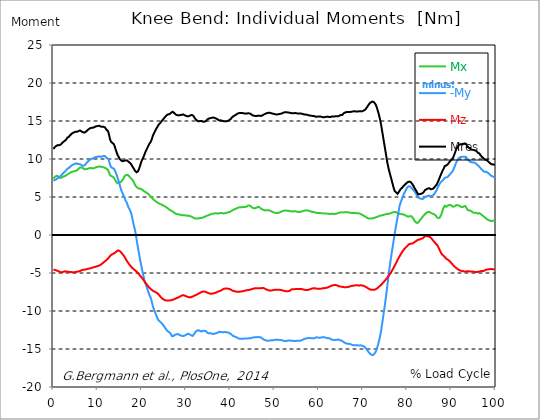
| Category |  Mx |  -My |  Mz |  Mres |
|---|---|---|---|---|
| 0.0 | 7.41 | 7.14 | -4.57 | 11.32 |
| 0.167348456675344 | 7.53 | 7.18 | -4.58 | 11.44 |
| 0.334696913350688 | 7.65 | 7.23 | -4.59 | 11.56 |
| 0.5020453700260321 | 7.73 | 7.28 | -4.61 | 11.65 |
| 0.669393826701376 | 7.78 | 7.34 | -4.65 | 11.73 |
| 0.83674228337672 | 7.78 | 7.41 | -4.7 | 11.79 |
| 1.0040907400520642 | 7.75 | 7.49 | -4.74 | 11.83 |
| 1.1621420602454444 | 7.68 | 7.55 | -4.78 | 11.83 |
| 1.3294905169207885 | 7.59 | 7.59 | -4.82 | 11.81 |
| 1.4968389735961325 | 7.5 | 7.67 | -4.86 | 11.82 |
| 1.6641874302714765 | 7.5 | 7.79 | -4.89 | 11.91 |
| 1.8315358869468206 | 7.57 | 7.88 | -4.9 | 12.01 |
| 1.9988843436221646 | 7.62 | 7.99 | -4.89 | 12.12 |
| 2.1662328002975086 | 7.67 | 8.09 | -4.87 | 12.2 |
| 2.333581256972853 | 7.71 | 8.2 | -4.83 | 12.29 |
| 2.5009297136481967 | 7.75 | 8.3 | -4.82 | 12.37 |
| 2.6682781703235405 | 7.77 | 8.37 | -4.78 | 12.43 |
| 2.8356266269988843 | 7.79 | 8.43 | -4.77 | 12.48 |
| 3.002975083674229 | 7.9 | 8.57 | -4.8 | 12.64 |
| 3.1703235403495724 | 8.01 | 8.72 | -4.82 | 12.82 |
| 3.337671997024917 | 8.03 | 8.79 | -4.84 | 12.89 |
| 3.4957233172182973 | 8.03 | 8.82 | -4.85 | 12.91 |
| 3.663071773893641 | 8.14 | 8.91 | -4.86 | 13.05 |
| 3.8304202305689854 | 8.22 | 9 | -4.88 | 13.17 |
| 3.997768687244329 | 8.27 | 9.08 | -4.88 | 13.25 |
| 4.165117143919673 | 8.3 | 9.17 | -4.9 | 13.34 |
| 4.332465600595017 | 8.33 | 9.23 | -4.91 | 13.41 |
| 4.499814057270361 | 8.35 | 9.28 | -4.92 | 13.46 |
| 4.667162513945706 | 8.39 | 9.32 | -4.92 | 13.51 |
| 4.834510970621049 | 8.44 | 9.35 | -4.9 | 13.56 |
| 5.001859427296393 | 8.44 | 9.4 | -4.87 | 13.58 |
| 5.169207883971737 | 8.46 | 9.43 | -4.86 | 13.61 |
| 5.336556340647081 | 8.49 | 9.38 | -4.84 | 13.59 |
| 5.503904797322425 | 8.59 | 9.35 | -4.82 | 13.62 |
| 5.671253253997769 | 8.69 | 9.33 | -4.79 | 13.66 |
| 5.82930457419115 | 8.77 | 9.33 | -4.77 | 13.7 |
| 5.996653030866494 | 8.87 | 9.32 | -4.74 | 13.76 |
| 6.164001487541838 | 8.92 | 9.28 | -4.7 | 13.75 |
| 6.331349944217181 | 8.88 | 9.16 | -4.64 | 13.63 |
| 6.498698400892526 | 8.85 | 9.1 | -4.6 | 13.55 |
| 6.66604685756787 | 8.8 | 9.11 | -4.58 | 13.53 |
| 6.833395314243213 | 8.71 | 9.12 | -4.56 | 13.47 |
| 7.000743770918558 | 8.66 | 9.16 | -4.56 | 13.47 |
| 7.168092227593902 | 8.65 | 9.23 | -4.55 | 13.51 |
| 7.335440684269246 | 8.67 | 9.33 | -4.53 | 13.58 |
| 7.50278914094459 | 8.66 | 9.45 | -4.51 | 13.65 |
| 7.6701375976199335 | 8.69 | 9.59 | -4.47 | 13.77 |
| 7.837486054295278 | 8.72 | 9.69 | -4.44 | 13.84 |
| 7.995537374488658 | 8.76 | 9.79 | -4.43 | 13.93 |
| 8.162885831164003 | 8.8 | 9.87 | -4.41 | 14.02 |
| 8.330234287839346 | 8.81 | 9.92 | -4.38 | 14.06 |
| 8.49758274451469 | 8.8 | 9.97 | -4.36 | 14.08 |
| 8.664931201190035 | 8.8 | 10.03 | -4.33 | 14.11 |
| 8.832279657865378 | 8.78 | 10.07 | -4.3 | 14.13 |
| 8.999628114540721 | 8.76 | 10.1 | -4.27 | 14.12 |
| 9.166976571216066 | 8.78 | 10.14 | -4.25 | 14.16 |
| 9.334325027891412 | 8.82 | 10.2 | -4.21 | 14.21 |
| 9.501673484566755 | 8.87 | 10.24 | -4.17 | 14.26 |
| 9.669021941242098 | 8.93 | 10.27 | -4.15 | 14.31 |
| 9.836370397917442 | 8.96 | 10.29 | -4.12 | 14.34 |
| 10.003718854592787 | 8.97 | 10.28 | -4.09 | 14.33 |
| 10.17106731126813 | 9 | 10.31 | -4.06 | 14.35 |
| 10.329118631461512 | 9.02 | 10.35 | -4.02 | 14.38 |
| 10.496467088136853 | 9.01 | 10.36 | -3.96 | 14.36 |
| 10.663815544812199 | 8.98 | 10.3 | -3.92 | 14.28 |
| 10.831164001487544 | 8.97 | 10.28 | -3.87 | 14.25 |
| 10.998512458162887 | 8.96 | 10.31 | -3.78 | 14.24 |
| 11.16586091483823 | 8.95 | 10.34 | -3.72 | 14.23 |
| 11.333209371513574 | 8.9 | 10.41 | -3.62 | 14.24 |
| 11.50055782818892 | 8.85 | 10.45 | -3.51 | 14.21 |
| 11.667906284864264 | 8.84 | 10.38 | -3.46 | 14.15 |
| 11.835254741539607 | 8.77 | 10.26 | -3.38 | 14.01 |
| 12.00260319821495 | 8.72 | 10.15 | -3.3 | 13.87 |
| 12.169951654890292 | 8.66 | 10.11 | -3.22 | 13.8 |
| 12.337300111565641 | 8.56 | 10.06 | -3.12 | 13.68 |
| 12.504648568240984 | 8.36 | 9.89 | -3 | 13.41 |
| 12.662699888434362 | 8.1 | 9.56 | -2.88 | 12.98 |
| 12.830048345109708 | 7.86 | 9.23 | -2.76 | 12.56 |
| 12.997396801785053 | 7.76 | 8.98 | -2.65 | 12.29 |
| 13.164745258460396 | 7.74 | 8.85 | -2.57 | 12.18 |
| 13.33209371513574 | 7.7 | 8.81 | -2.53 | 12.12 |
| 13.499442171811083 | 7.65 | 8.75 | -2.5 | 12.04 |
| 13.666790628486426 | 7.56 | 8.74 | -2.44 | 11.96 |
| 13.834139085161771 | 7.4 | 8.58 | -2.37 | 11.72 |
| 14.001487541837117 | 7.21 | 8.35 | -2.3 | 11.41 |
| 14.16883599851246 | 7.02 | 8.13 | -2.22 | 11.12 |
| 14.336184455187803 | 6.89 | 7.86 | -2.14 | 10.83 |
| 14.503532911863147 | 6.82 | 7.56 | -2.05 | 10.56 |
| 14.670881368538492 | 6.84 | 7.27 | -2.02 | 10.37 |
| 14.828932688731873 | 6.89 | 6.94 | -2.03 | 10.2 |
| 14.996281145407215 | 6.89 | 6.58 | -2.11 | 10 |
| 15.163629602082558 | 6.96 | 6.25 | -2.2 | 9.89 |
| 15.330978058757903 | 7.05 | 5.93 | -2.3 | 9.8 |
| 15.498326515433247 | 7.13 | 5.67 | -2.42 | 9.73 |
| 15.665674972108594 | 7.22 | 5.49 | -2.54 | 9.71 |
| 15.833023428783937 | 7.41 | 5.25 | -2.66 | 9.75 |
| 16.00037188545928 | 7.63 | 5 | -2.79 | 9.77 |
| 16.167720342134626 | 7.78 | 4.78 | -2.96 | 9.81 |
| 16.335068798809967 | 7.87 | 4.52 | -3.12 | 9.81 |
| 16.502417255485312 | 7.9 | 4.43 | -3.3 | 9.86 |
| 16.669765712160658 | 7.92 | 4.16 | -3.45 | 9.81 |
| 16.837114168836 | 7.91 | 3.87 | -3.59 | 9.73 |
| 17.004462625511344 | 7.82 | 3.61 | -3.72 | 9.63 |
| 17.16251394570472 | 7.7 | 3.46 | -3.87 | 9.56 |
| 17.32986240238007 | 7.63 | 3.24 | -4 | 9.49 |
| 17.497210859055414 | 7.51 | 3 | -4.12 | 9.36 |
| 17.664559315730756 | 7.39 | 2.72 | -4.24 | 9.23 |
| 17.8319077724061 | 7.27 | 2.25 | -4.33 | 9.06 |
| 17.999256229081443 | 7.14 | 1.79 | -4.42 | 8.9 |
| 18.166604685756788 | 6.99 | 1.3 | -4.5 | 8.75 |
| 18.333953142432133 | 6.77 | 0.95 | -4.58 | 8.58 |
| 18.501301599107478 | 6.56 | 0.55 | -4.66 | 8.41 |
| 18.668650055782823 | 6.42 | -0.01 | -4.74 | 8.31 |
| 18.835998512458165 | 6.32 | -0.66 | -4.83 | 8.25 |
| 19.00334696913351 | 6.23 | -1.24 | -4.93 | 8.29 |
| 19.170695425808855 | 6.15 | -1.81 | -5.04 | 8.41 |
| 19.338043882484197 | 6.11 | -2.35 | -5.15 | 8.64 |
| 19.496095202677576 | 6.1 | -2.89 | -5.27 | 8.92 |
| 19.66344365935292 | 6.08 | -3.41 | -5.39 | 9.22 |
| 19.830792116028263 | 6.05 | -3.91 | -5.5 | 9.56 |
| 19.998140572703612 | 6.01 | -4.39 | -5.63 | 9.8 |
| 20.165489029378953 | 5.93 | -4.85 | -5.75 | 10.01 |
| 20.3328374860543 | 5.84 | -5.32 | -5.87 | 10.21 |
| 20.500185942729644 | 5.76 | -5.69 | -6.01 | 10.44 |
| 20.667534399404985 | 5.7 | -6.13 | -6.15 | 10.7 |
| 20.83488285608033 | 5.64 | -6.43 | -6.3 | 10.94 |
| 21.002231312755672 | 5.6 | -6.67 | -6.43 | 11.15 |
| 21.16957976943102 | 5.54 | -6.95 | -6.55 | 11.36 |
| 21.336928226106362 | 5.46 | -7.23 | -6.67 | 11.55 |
| 21.504276682781704 | 5.37 | -7.53 | -6.79 | 11.75 |
| 21.67162513945705 | 5.28 | -7.83 | -6.9 | 11.96 |
| 21.82967645965043 | 5.18 | -8.04 | -7.01 | 12.11 |
| 21.997024916325774 | 5.08 | -8.23 | -7.11 | 12.25 |
| 22.16437337300112 | 4.96 | -8.57 | -7.18 | 12.47 |
| 22.33172182967646 | 4.87 | -8.98 | -7.25 | 12.76 |
| 22.499070286351806 | 4.75 | -9.39 | -7.33 | 13.06 |
| 22.666418743027148 | 4.65 | -9.67 | -7.39 | 13.28 |
| 22.833767199702496 | 4.57 | -9.92 | -7.44 | 13.47 |
| 23.00111565637784 | 4.49 | -10.16 | -7.5 | 13.66 |
| 23.168464113053183 | 4.42 | -10.43 | -7.54 | 13.86 |
| 23.335812569728528 | 4.35 | -10.68 | -7.59 | 14.05 |
| 23.50316102640387 | 4.3 | -10.89 | -7.66 | 14.2 |
| 23.670509483079215 | 4.23 | -11.12 | -7.74 | 14.38 |
| 23.83785793975456 | 4.16 | -11.27 | -7.85 | 14.53 |
| 23.995909259947936 | 4.11 | -11.37 | -7.96 | 14.65 |
| 24.163257716623285 | 4.06 | -11.41 | -8.08 | 14.73 |
| 24.330606173298627 | 4.05 | -11.53 | -8.18 | 14.87 |
| 24.49795462997397 | 4 | -11.62 | -8.28 | 14.99 |
| 24.665303086649313 | 3.94 | -11.71 | -8.37 | 15.1 |
| 24.83265154332466 | 3.89 | -11.84 | -8.45 | 15.23 |
| 25.0 | 3.83 | -11.99 | -8.51 | 15.35 |
| 25.167348456675345 | 3.78 | -12.13 | -8.56 | 15.47 |
| 25.334696913350694 | 3.73 | -12.26 | -8.59 | 15.58 |
| 25.502045370026035 | 3.68 | -12.41 | -8.61 | 15.69 |
| 25.669393826701377 | 3.6 | -12.56 | -8.62 | 15.79 |
| 25.836742283376722 | 3.53 | -12.63 | -8.61 | 15.82 |
| 26.004090740052067 | 3.46 | -12.72 | -8.61 | 15.88 |
| 26.17143919672741 | 3.39 | -12.81 | -8.62 | 15.93 |
| 26.329490516920792 | 3.3 | -12.85 | -8.61 | 15.93 |
| 26.49683897359613 | 3.22 | -12.92 | -8.6 | 15.95 |
| 26.66418743027148 | 3.19 | -13.15 | -8.58 | 16.11 |
| 26.831535886946828 | 3.15 | -13.32 | -8.55 | 16.22 |
| 26.998884343622166 | 3.08 | -13.36 | -8.53 | 16.22 |
| 27.166232800297514 | 3.01 | -13.28 | -8.49 | 16.12 |
| 27.333581256972852 | 2.93 | -13.24 | -8.43 | 16.04 |
| 27.5009297136482 | 2.86 | -13.14 | -8.4 | 15.93 |
| 27.668278170323543 | 2.8 | -13.08 | -8.36 | 15.85 |
| 27.835626626998888 | 2.78 | -13.06 | -8.31 | 15.8 |
| 28.002975083674233 | 2.74 | -13.05 | -8.28 | 15.77 |
| 28.170323540349575 | 2.72 | -13.03 | -8.24 | 15.73 |
| 28.33767199702492 | 2.7 | -13.07 | -8.2 | 15.74 |
| 28.50502045370026 | 2.68 | -13.14 | -8.13 | 15.77 |
| 28.663071773893645 | 2.67 | -13.18 | -8.09 | 15.78 |
| 28.830420230568986 | 2.65 | -13.22 | -8.04 | 15.78 |
| 28.99776868724433 | 2.62 | -13.28 | -7.98 | 15.81 |
| 29.165117143919673 | 2.6 | -13.3 | -7.94 | 15.81 |
| 29.33246560059502 | 2.61 | -13.37 | -7.94 | 15.87 |
| 29.499814057270367 | 2.59 | -13.27 | -7.94 | 15.77 |
| 29.66716251394571 | 2.59 | -13.26 | -7.97 | 15.77 |
| 29.834510970621054 | 2.58 | -13.2 | -8.01 | 15.73 |
| 30.00185942729639 | 2.57 | -13.12 | -8.06 | 15.67 |
| 30.169207883971744 | 2.56 | -13.06 | -8.09 | 15.64 |
| 30.33655634064708 | 2.54 | -13.03 | -8.12 | 15.62 |
| 30.50390479732243 | 2.54 | -12.99 | -8.16 | 15.61 |
| 30.671253253997772 | 2.54 | -13 | -8.2 | 15.64 |
| 30.829304574191156 | 2.5 | -13.08 | -8.21 | 15.7 |
| 30.996653030866494 | 2.46 | -13.15 | -8.2 | 15.75 |
| 31.164001487541842 | 2.42 | -13.21 | -8.18 | 15.79 |
| 31.331349944217187 | 2.39 | -13.24 | -8.14 | 15.79 |
| 31.498698400892525 | 2.34 | -13.27 | -8.09 | 15.78 |
| 31.666046857567874 | 2.27 | -13.2 | -8.04 | 15.68 |
| 31.833395314243212 | 2.22 | -13.01 | -8 | 15.5 |
| 32.00074377091856 | 2.17 | -12.89 | -7.95 | 15.37 |
| 32.1680922275939 | 2.15 | -12.74 | -7.91 | 15.23 |
| 32.33544068426925 | 2.16 | -12.64 | -7.86 | 15.12 |
| 32.50278914094459 | 2.17 | -12.57 | -7.82 | 15.04 |
| 32.670137597619934 | 2.18 | -12.54 | -7.76 | 14.99 |
| 32.83748605429528 | 2.19 | -12.54 | -7.71 | 14.96 |
| 33.004834510970625 | 2.2 | -12.56 | -7.67 | 14.96 |
| 33.162885831164004 | 2.22 | -12.63 | -7.61 | 14.99 |
| 33.33023428783935 | 2.24 | -12.69 | -7.54 | 15.03 |
| 33.497582744514695 | 2.25 | -12.69 | -7.5 | 15.01 |
| 33.664931201190036 | 2.27 | -12.65 | -7.47 | 14.96 |
| 33.83227965786538 | 2.3 | -12.6 | -7.45 | 14.91 |
| 33.99962811454073 | 2.34 | -12.61 | -7.44 | 14.91 |
| 34.16697657121607 | 2.39 | -12.62 | -7.45 | 14.92 |
| 34.33432502789141 | 2.43 | -12.64 | -7.47 | 14.95 |
| 34.50167348456676 | 2.48 | -12.65 | -7.49 | 14.98 |
| 34.6690219412421 | 2.52 | -12.72 | -7.54 | 15.08 |
| 34.83637039791744 | 2.53 | -12.87 | -7.6 | 15.23 |
| 35.00371885459279 | 2.58 | -12.9 | -7.63 | 15.29 |
| 35.17106731126814 | 2.62 | -12.93 | -7.66 | 15.33 |
| 35.338415767943474 | 2.66 | -12.93 | -7.7 | 15.36 |
| 35.49646708813686 | 2.72 | -12.92 | -7.73 | 15.37 |
| 35.6638155448122 | 2.76 | -12.92 | -7.73 | 15.38 |
| 35.831164001487544 | 2.79 | -12.97 | -7.72 | 15.42 |
| 35.998512458162885 | 2.8 | -13.02 | -7.7 | 15.45 |
| 36.165860914838234 | 2.8 | -13.04 | -7.68 | 15.47 |
| 36.333209371513576 | 2.82 | -13.01 | -7.66 | 15.43 |
| 36.50055782818892 | 2.82 | -12.97 | -7.63 | 15.39 |
| 36.667906284864266 | 2.86 | -12.92 | -7.6 | 15.35 |
| 36.83525474153961 | 2.86 | -12.91 | -7.56 | 15.32 |
| 37.002603198214956 | 2.84 | -12.92 | -7.51 | 15.29 |
| 37.1699516548903 | 2.82 | -12.85 | -7.46 | 15.2 |
| 37.337300111565646 | 2.84 | -12.77 | -7.43 | 15.13 |
| 37.50464856824098 | 2.85 | -12.73 | -7.39 | 15.07 |
| 37.66269988843437 | 2.89 | -12.74 | -7.36 | 15.07 |
| 37.83004834510971 | 2.93 | -12.76 | -7.33 | 15.09 |
| 37.99739680178505 | 2.91 | -12.79 | -7.28 | 15.08 |
| 38.16474525846039 | 2.86 | -12.78 | -7.2 | 15.03 |
| 38.33209371513574 | 2.84 | -12.78 | -7.13 | 14.99 |
| 38.49944217181109 | 2.83 | -12.78 | -7.09 | 14.97 |
| 38.666790628486424 | 2.85 | -12.77 | -7.07 | 14.95 |
| 38.83413908516178 | 2.87 | -12.77 | -7.05 | 14.95 |
| 39.001487541837115 | 2.89 | -12.77 | -7.05 | 14.96 |
| 39.16883599851246 | 2.93 | -12.79 | -7.05 | 14.98 |
| 39.336184455187805 | 2.95 | -12.81 | -7.05 | 15 |
| 39.503532911863154 | 2.98 | -12.83 | -7.06 | 15.03 |
| 39.670881368538495 | 3 | -12.89 | -7.08 | 15.09 |
| 39.83822982521384 | 3 | -12.93 | -7.11 | 15.14 |
| 39.996281145407224 | 3.06 | -12.95 | -7.15 | 15.19 |
| 40.163629602082565 | 3.12 | -13.03 | -7.2 | 15.3 |
| 40.33097805875791 | 3.19 | -13.15 | -7.27 | 15.45 |
| 40.498326515433256 | 3.25 | -13.23 | -7.32 | 15.55 |
| 40.6656749721086 | 3.3 | -13.27 | -7.36 | 15.61 |
| 40.83302342878393 | 3.36 | -13.33 | -7.38 | 15.69 |
| 41.00037188545929 | 3.41 | -13.36 | -7.4 | 15.73 |
| 41.16772034213463 | 3.43 | -13.4 | -7.42 | 15.78 |
| 41.33506879880997 | 3.47 | -13.44 | -7.46 | 15.84 |
| 41.50241725548531 | 3.54 | -13.48 | -7.48 | 15.89 |
| 41.66976571216066 | 3.57 | -13.57 | -7.47 | 15.98 |
| 41.837114168836 | 3.61 | -13.62 | -7.46 | 16.02 |
| 42.004462625511344 | 3.64 | -13.64 | -7.45 | 16.04 |
| 42.17181108218669 | 3.65 | -13.65 | -7.45 | 16.05 |
| 42.32986240238007 | 3.65 | -13.65 | -7.44 | 16.05 |
| 42.497210859055414 | 3.65 | -13.65 | -7.44 | 16.05 |
| 42.66455931573076 | 3.66 | -13.65 | -7.42 | 16.05 |
| 42.831907772406105 | 3.67 | -13.66 | -7.4 | 16.04 |
| 42.999256229081446 | 3.68 | -13.63 | -7.38 | 16.01 |
| 43.16660468575679 | 3.67 | -13.63 | -7.35 | 16.01 |
| 43.33395314243214 | 3.69 | -13.63 | -7.31 | 15.99 |
| 43.50130159910748 | 3.71 | -13.61 | -7.29 | 15.97 |
| 43.66865005578282 | 3.73 | -13.61 | -7.27 | 15.98 |
| 43.83599851245817 | 3.8 | -13.61 | -7.26 | 15.99 |
| 44.00334696913351 | 3.87 | -13.61 | -7.24 | 16.01 |
| 44.17069542580886 | 3.89 | -13.6 | -7.23 | 16.01 |
| 44.3380438824842 | 3.89 | -13.6 | -7.22 | 16 |
| 44.49609520267758 | 3.86 | -13.6 | -7.19 | 15.98 |
| 44.66344365935292 | 3.76 | -13.56 | -7.17 | 15.91 |
| 44.83079211602827 | 3.67 | -13.53 | -7.14 | 15.83 |
| 44.99814057270361 | 3.58 | -13.5 | -7.11 | 15.76 |
| 45.16548902937895 | 3.53 | -13.48 | -7.07 | 15.72 |
| 45.332837486054295 | 3.53 | -13.47 | -7.04 | 15.69 |
| 45.500185942729644 | 3.53 | -13.46 | -7.02 | 15.67 |
| 45.66753439940499 | 3.53 | -13.46 | -7.01 | 15.67 |
| 45.83488285608033 | 3.55 | -13.45 | -7 | 15.66 |
| 46.00223131275568 | 3.62 | -13.43 | -7.01 | 15.67 |
| 46.16957976943102 | 3.67 | -13.43 | -7 | 15.69 |
| 46.336928226106366 | 3.71 | -13.43 | -7.01 | 15.71 |
| 46.50427668278171 | 3.69 | -13.44 | -7.01 | 15.71 |
| 46.671625139457056 | 3.61 | -13.44 | -7.01 | 15.68 |
| 46.829676459650436 | 3.51 | -13.44 | -7 | 15.64 |
| 46.99702491632577 | 3.44 | -13.51 | -6.98 | 15.67 |
| 47.16437337300112 | 3.4 | -13.58 | -6.98 | 15.71 |
| 47.33172182967646 | 3.35 | -13.66 | -6.97 | 15.76 |
| 47.49907028635181 | 3.3 | -13.73 | -6.98 | 15.81 |
| 47.66641874302716 | 3.27 | -13.8 | -7.01 | 15.88 |
| 47.83376719970249 | 3.23 | -13.83 | -7.06 | 15.91 |
| 48.001115656377834 | 3.25 | -13.86 | -7.11 | 15.96 |
| 48.16846411305319 | 3.27 | -13.88 | -7.16 | 16.01 |
| 48.33581256972853 | 3.27 | -13.91 | -7.2 | 16.05 |
| 48.50316102640387 | 3.25 | -13.92 | -7.24 | 16.07 |
| 48.67050948307921 | 3.25 | -13.91 | -7.29 | 16.08 |
| 48.837857939754564 | 3.22 | -13.89 | -7.3 | 16.07 |
| 49.005206396429905 | 3.2 | -13.88 | -7.32 | 16.07 |
| 49.163257716623285 | 3.16 | -13.87 | -7.32 | 16.05 |
| 49.33060617329863 | 3.11 | -13.85 | -7.31 | 16.01 |
| 49.49795462997397 | 3.07 | -13.84 | -7.29 | 15.99 |
| 49.66530308664932 | 3.02 | -13.83 | -7.26 | 15.96 |
| 49.832651543324666 | 2.99 | -13.84 | -7.23 | 15.95 |
| 50.0 | 2.94 | -13.82 | -7.22 | 15.92 |
| 50.16734845667534 | 2.91 | -13.79 | -7.21 | 15.88 |
| 50.33469691335069 | 2.89 | -13.77 | -7.2 | 15.86 |
| 50.50204537002604 | 2.89 | -13.77 | -7.2 | 15.85 |
| 50.66939382670139 | 2.89 | -13.78 | -7.2 | 15.87 |
| 50.836742283376715 | 2.91 | -13.78 | -7.2 | 15.88 |
| 51.00409074005207 | 2.94 | -13.82 | -7.2 | 15.91 |
| 51.17143919672741 | 2.97 | -13.82 | -7.2 | 15.93 |
| 51.32949051692079 | 3.02 | -13.82 | -7.22 | 15.94 |
| 51.496838973596134 | 3.06 | -13.83 | -7.24 | 15.97 |
| 51.66418743027148 | 3.11 | -13.84 | -7.27 | 16 |
| 51.831535886946824 | 3.14 | -13.87 | -7.3 | 16.04 |
| 51.99888434362217 | 3.17 | -13.91 | -7.32 | 16.09 |
| 52.16623280029752 | 3.2 | -13.95 | -7.34 | 16.14 |
| 52.33358125697285 | 3.21 | -13.95 | -7.37 | 16.16 |
| 52.5009297136482 | 3.22 | -13.94 | -7.39 | 16.16 |
| 52.668278170323546 | 3.21 | -13.93 | -7.41 | 16.16 |
| 52.835626626998895 | 3.2 | -13.93 | -7.41 | 16.16 |
| 53.00297508367424 | 3.19 | -13.91 | -7.4 | 16.13 |
| 53.17032354034958 | 3.17 | -13.88 | -7.38 | 16.1 |
| 53.33767199702492 | 3.17 | -13.88 | -7.37 | 16.1 |
| 53.50502045370027 | 3.16 | -13.89 | -7.33 | 16.09 |
| 53.663071773893655 | 3.12 | -13.9 | -7.24 | 16.05 |
| 53.83042023056899 | 3.1 | -13.91 | -7.16 | 16.03 |
| 53.99776868724433 | 3.1 | -13.92 | -7.14 | 16.03 |
| 54.16511714391967 | 3.1 | -13.92 | -7.13 | 16.02 |
| 54.33246560059503 | 3.11 | -13.93 | -7.13 | 16.03 |
| 54.49981405727037 | 3.12 | -13.95 | -7.13 | 16.05 |
| 54.667162513945705 | 3.13 | -13.95 | -7.12 | 16.05 |
| 54.834510970621054 | 3.11 | -13.94 | -7.11 | 16.03 |
| 55.0018594272964 | 3.08 | -13.93 | -7.1 | 16.01 |
| 55.169207883971744 | 3.05 | -13.92 | -7.1 | 15.99 |
| 55.336556340647086 | 3.03 | -13.91 | -7.1 | 15.98 |
| 55.50390479732243 | 3.02 | -13.93 | -7.1 | 15.99 |
| 55.671253253997776 | 3.04 | -13.91 | -7.11 | 15.99 |
| 55.83860171067312 | 3.07 | -13.91 | -7.11 | 15.99 |
| 55.9966530308665 | 3.08 | -13.88 | -7.11 | 15.98 |
| 56.16400148754184 | 3.1 | -13.84 | -7.12 | 15.95 |
| 56.33134994421718 | 3.12 | -13.79 | -7.14 | 15.93 |
| 56.498698400892536 | 3.15 | -13.74 | -7.17 | 15.9 |
| 56.66604685756788 | 3.19 | -13.68 | -7.19 | 15.87 |
| 56.83339531424321 | 3.23 | -13.65 | -7.21 | 15.85 |
| 57.00074377091856 | 3.24 | -13.63 | -7.22 | 15.85 |
| 57.16809222759391 | 3.24 | -13.62 | -7.24 | 15.85 |
| 57.33544068426925 | 3.23 | -13.6 | -7.24 | 15.83 |
| 57.5027891409446 | 3.22 | -13.57 | -7.23 | 15.8 |
| 57.670137597619934 | 3.21 | -13.54 | -7.2 | 15.76 |
| 57.83748605429528 | 3.16 | -13.55 | -7.18 | 15.74 |
| 58.004834510970625 | 3.14 | -13.55 | -7.15 | 15.72 |
| 58.16288583116401 | 3.11 | -13.57 | -7.11 | 15.71 |
| 58.330234287839346 | 3.07 | -13.59 | -7.07 | 15.69 |
| 58.497582744514695 | 3.05 | -13.59 | -7.04 | 15.67 |
| 58.66493120119004 | 3.04 | -13.59 | -7.02 | 15.66 |
| 58.832279657865385 | 3.01 | -13.6 | -7 | 15.65 |
| 58.999628114540734 | 3 | -13.59 | -6.99 | 15.64 |
| 59.16697657121607 | 2.96 | -13.54 | -7 | 15.6 |
| 59.33432502789142 | 2.94 | -13.5 | -7.02 | 15.57 |
| 59.50167348456676 | 2.87 | -13.46 | -7.06 | 15.55 |
| 59.66902194124211 | 2.88 | -13.48 | -7.07 | 15.57 |
| 59.83637039791745 | 2.9 | -13.5 | -7.07 | 15.59 |
| 60.00371885459278 | 2.9 | -13.51 | -7.08 | 15.6 |
| 60.17106731126813 | 2.9 | -13.51 | -7.09 | 15.6 |
| 60.33841576794349 | 2.89 | -13.51 | -7.08 | 15.6 |
| 60.49646708813685 | 2.89 | -13.5 | -7.07 | 15.58 |
| 60.6638155448122 | 2.86 | -13.47 | -7.05 | 15.54 |
| 60.831164001487544 | 2.85 | -13.46 | -7.02 | 15.51 |
| 60.99851245816289 | 2.84 | -13.44 | -7.01 | 15.49 |
| 61.16586091483824 | 2.84 | -13.43 | -7 | 15.48 |
| 61.333209371513576 | 2.83 | -13.47 | -6.98 | 15.51 |
| 61.50055782818892 | 2.82 | -13.51 | -6.97 | 15.54 |
| 61.667906284864266 | 2.82 | -13.53 | -6.96 | 15.55 |
| 61.835254741539615 | 2.81 | -13.55 | -6.94 | 15.55 |
| 62.002603198214956 | 2.81 | -13.59 | -6.91 | 15.58 |
| 62.16995165489029 | 2.79 | -13.6 | -6.87 | 15.56 |
| 62.33730011156564 | 2.78 | -13.59 | -6.83 | 15.53 |
| 62.504648568240995 | 2.77 | -13.6 | -6.78 | 15.51 |
| 62.67199702491633 | 2.77 | -13.64 | -6.74 | 15.53 |
| 62.83004834510971 | 2.79 | -13.74 | -6.67 | 15.59 |
| 62.99739680178505 | 2.79 | -13.77 | -6.64 | 15.6 |
| 63.1647452584604 | 2.78 | -13.78 | -6.63 | 15.59 |
| 63.33209371513575 | 2.78 | -13.79 | -6.61 | 15.6 |
| 63.4994421718111 | 2.77 | -13.82 | -6.59 | 15.61 |
| 63.666790628486424 | 2.77 | -13.81 | -6.59 | 15.61 |
| 63.83413908516177 | 2.79 | -13.8 | -6.59 | 15.6 |
| 64.00148754183712 | 2.8 | -13.8 | -6.6 | 15.61 |
| 64.16883599851248 | 2.83 | -13.78 | -6.62 | 15.6 |
| 64.3361844551878 | 2.89 | -13.75 | -6.67 | 15.61 |
| 64.50353291186315 | 2.95 | -13.76 | -6.74 | 15.65 |
| 64.6708813685385 | 2.96 | -13.8 | -6.77 | 15.7 |
| 64.83822982521384 | 2.97 | -13.86 | -6.78 | 15.76 |
| 65.00557828188919 | 2.97 | -13.9 | -6.79 | 15.8 |
| 65.16362960208257 | 2.97 | -13.89 | -6.8 | 15.8 |
| 65.3309780587579 | 2.98 | -13.89 | -6.81 | 15.8 |
| 65.49832651543326 | 2.98 | -14.02 | -6.84 | 15.93 |
| 65.6656749721086 | 2.97 | -14.11 | -6.87 | 16.02 |
| 65.83302342878395 | 2.98 | -14.16 | -6.87 | 16.07 |
| 66.00037188545929 | 3 | -14.22 | -6.88 | 16.13 |
| 66.16772034213463 | 2.99 | -14.27 | -6.87 | 16.16 |
| 66.33506879880998 | 2.99 | -14.29 | -6.86 | 16.18 |
| 66.50241725548531 | 2.98 | -14.3 | -6.85 | 16.19 |
| 66.66976571216065 | 2.98 | -14.31 | -6.83 | 16.19 |
| 66.83711416883601 | 2.96 | -14.32 | -6.81 | 16.19 |
| 67.00446262551135 | 2.94 | -14.33 | -6.78 | 16.18 |
| 67.1718110821867 | 2.93 | -14.35 | -6.75 | 16.18 |
| 67.32986240238007 | 2.91 | -14.4 | -6.73 | 16.21 |
| 67.49721085905541 | 2.88 | -14.44 | -6.7 | 16.24 |
| 67.66455931573076 | 2.88 | -14.47 | -6.69 | 16.25 |
| 67.83190777240611 | 2.89 | -14.49 | -6.67 | 16.27 |
| 67.99925622908145 | 2.9 | -14.51 | -6.65 | 16.28 |
| 68.16660468575678 | 2.88 | -14.52 | -6.63 | 16.27 |
| 68.33395314243214 | 2.88 | -14.51 | -6.63 | 16.26 |
| 68.50130159910749 | 2.88 | -14.49 | -6.62 | 16.24 |
| 68.66865005578282 | 2.87 | -14.49 | -6.62 | 16.24 |
| 68.83599851245816 | 2.88 | -14.52 | -6.63 | 16.27 |
| 69.00334696913352 | 2.86 | -14.52 | -6.63 | 16.27 |
| 69.17069542580886 | 2.83 | -14.53 | -6.64 | 16.28 |
| 69.3380438824842 | 2.81 | -14.53 | -6.63 | 16.28 |
| 69.50539233915956 | 2.75 | -14.52 | -6.61 | 16.25 |
| 69.66344365935292 | 2.7 | -14.54 | -6.62 | 16.26 |
| 69.83079211602826 | 2.65 | -14.57 | -6.64 | 16.29 |
| 69.99814057270362 | 2.6 | -14.61 | -6.66 | 16.32 |
| 70.16548902937896 | 2.54 | -14.65 | -6.7 | 16.37 |
| 70.33283748605429 | 2.48 | -14.71 | -6.74 | 16.42 |
| 70.50018594272964 | 2.42 | -14.78 | -6.78 | 16.49 |
| 70.667534399405 | 2.37 | -14.87 | -6.85 | 16.59 |
| 70.83488285608033 | 2.26 | -15.05 | -6.9 | 16.75 |
| 71.00223131275568 | 2.23 | -15.15 | -6.95 | 16.86 |
| 71.16957976943102 | 2.19 | -15.32 | -7.02 | 17.04 |
| 71.33692822610637 | 2.17 | -15.42 | -7.1 | 17.17 |
| 71.50427668278171 | 2.17 | -15.56 | -7.14 | 17.31 |
| 71.67162513945706 | 2.16 | -15.68 | -7.16 | 17.43 |
| 71.8389735961324 | 2.17 | -15.72 | -7.19 | 17.48 |
| 71.99702491632577 | 2.17 | -15.79 | -7.2 | 17.54 |
| 72.16437337300113 | 2.18 | -15.81 | -7.21 | 17.56 |
| 72.33172182967647 | 2.21 | -15.76 | -7.22 | 17.52 |
| 72.49907028635181 | 2.24 | -15.7 | -7.21 | 17.47 |
| 72.66641874302715 | 2.27 | -15.59 | -7.18 | 17.37 |
| 72.8337671997025 | 2.31 | -15.42 | -7.15 | 17.21 |
| 73.00111565637783 | 2.35 | -15.21 | -7.09 | 17 |
| 73.16846411305319 | 2.38 | -14.92 | -7.04 | 16.72 |
| 73.33581256972853 | 2.41 | -14.58 | -6.97 | 16.4 |
| 73.50316102640387 | 2.46 | -14.24 | -6.88 | 16.06 |
| 73.67050948307921 | 2.5 | -13.85 | -6.79 | 15.7 |
| 73.83785793975457 | 2.54 | -13.45 | -6.7 | 15.3 |
| 74.00520639642991 | 2.56 | -12.92 | -6.61 | 14.81 |
| 74.16325771662328 | 2.59 | -12.39 | -6.52 | 14.31 |
| 74.33060617329863 | 2.61 | -11.69 | -6.41 | 13.67 |
| 74.49795462997398 | 2.62 | -11.08 | -6.31 | 13.12 |
| 74.66530308664932 | 2.64 | -10.37 | -6.21 | 12.51 |
| 74.83265154332466 | 2.67 | -9.71 | -6.09 | 11.94 |
| 75.00000000000001 | 2.71 | -9.04 | -5.98 | 11.36 |
| 75.16734845667534 | 2.74 | -8.29 | -5.86 | 10.76 |
| 75.3346969133507 | 2.75 | -7.52 | -5.73 | 10.17 |
| 75.50204537002605 | 2.76 | -6.73 | -5.61 | 9.56 |
| 75.66939382670138 | 2.77 | -5.91 | -5.48 | 9.1 |
| 75.83674228337672 | 2.78 | -5.14 | -5.36 | 8.65 |
| 76.00409074005208 | 2.81 | -4.4 | -5.22 | 8.28 |
| 76.17143919672742 | 2.84 | -3.67 | -5.08 | 7.91 |
| 76.33878765340276 | 2.88 | -3 | -4.93 | 7.57 |
| 76.49683897359614 | 2.92 | -2.37 | -4.76 | 7.2 |
| 76.66418743027148 | 2.96 | -1.74 | -4.58 | 6.81 |
| 76.83153588694682 | 2.99 | -1.13 | -4.41 | 6.44 |
| 76.99888434362218 | 3.01 | -0.48 | -4.23 | 6.1 |
| 77.16623280029752 | 3.01 | 0.14 | -4.04 | 5.79 |
| 77.33358125697285 | 3.03 | 0.69 | -3.87 | 5.67 |
| 77.5009297136482 | 2.99 | 1.26 | -3.67 | 5.61 |
| 77.66827817032356 | 2.94 | 1.83 | -3.48 | 5.56 |
| 77.83562662699889 | 2.9 | 2.39 | -3.27 | 5.42 |
| 78.00297508367423 | 2.85 | 2.9 | -3.08 | 5.51 |
| 78.17032354034959 | 2.81 | 3.47 | -2.91 | 5.71 |
| 78.33767199702493 | 2.77 | 3.94 | -2.75 | 5.88 |
| 78.50502045370027 | 2.76 | 4.26 | -2.59 | 6.02 |
| 78.67236891037561 | 2.74 | 4.51 | -2.42 | 6.1 |
| 78.83042023056899 | 2.73 | 4.74 | -2.26 | 6.2 |
| 78.99776868724433 | 2.72 | 5.01 | -2.12 | 6.32 |
| 79.16511714391969 | 2.7 | 5.27 | -1.97 | 6.44 |
| 79.33246560059503 | 2.67 | 5.52 | -1.84 | 6.55 |
| 79.49981405727036 | 2.61 | 5.68 | -1.75 | 6.62 |
| 79.66716251394571 | 2.56 | 5.87 | -1.65 | 6.72 |
| 79.83451097062107 | 2.49 | 6.07 | -1.55 | 6.82 |
| 80.00185942729641 | 2.46 | 6.25 | -1.45 | 6.93 |
| 80.16920788397174 | 2.44 | 6.34 | -1.35 | 6.97 |
| 80.33655634064709 | 2.42 | 6.41 | -1.27 | 7.01 |
| 80.50390479732243 | 2.43 | 6.44 | -1.19 | 7.03 |
| 80.67125325399778 | 2.49 | 6.39 | -1.17 | 7.01 |
| 80.83860171067312 | 2.51 | 6.32 | -1.15 | 6.95 |
| 80.99665303086651 | 2.44 | 6.19 | -1.14 | 6.82 |
| 81.16400148754184 | 2.36 | 6.09 | -1.11 | 6.7 |
| 81.3313499442172 | 2.22 | 5.97 | -1.05 | 6.54 |
| 81.49869840089255 | 2.01 | 5.87 | -1 | 6.37 |
| 81.66604685756786 | 1.86 | 5.71 | -0.95 | 6.18 |
| 81.83339531424322 | 1.74 | 5.57 | -0.87 | 6.01 |
| 82.00074377091858 | 1.65 | 5.44 | -0.8 | 5.86 |
| 82.16809222759392 | 1.6 | 5.28 | -0.74 | 5.69 |
| 82.33544068426926 | 1.58 | 5.11 | -0.68 | 5.51 |
| 82.50278914094459 | 1.62 | 4.9 | -0.62 | 5.33 |
| 82.67013759761994 | 1.74 | 4.81 | -0.6 | 5.29 |
| 82.83748605429528 | 1.91 | 4.83 | -0.59 | 5.39 |
| 83.00483451097062 | 2.02 | 4.81 | -0.55 | 5.43 |
| 83.17218296764597 | 2.14 | 4.76 | -0.5 | 5.42 |
| 83.33023428783935 | 2.28 | 4.71 | -0.47 | 5.43 |
| 83.4975827445147 | 2.4 | 4.74 | -0.43 | 5.51 |
| 83.66493120119004 | 2.52 | 4.74 | -0.33 | 5.55 |
| 83.83227965786537 | 2.62 | 4.9 | -0.26 | 5.72 |
| 83.99962811454073 | 2.73 | 5.04 | -0.19 | 5.89 |
| 84.16697657121607 | 2.84 | 5.03 | -0.14 | 5.94 |
| 84.33432502789142 | 2.92 | 5.07 | -0.14 | 6.01 |
| 84.50167348456677 | 2.98 | 5.11 | -0.15 | 6.08 |
| 84.6690219412421 | 3.02 | 5.14 | -0.17 | 6.11 |
| 84.83637039791745 | 3.04 | 5.17 | -0.2 | 6.15 |
| 85.0037188545928 | 3.05 | 5.19 | -0.23 | 6.16 |
| 85.17106731126813 | 3 | 5.13 | -0.27 | 6.09 |
| 85.33841576794349 | 2.92 | 5.09 | -0.35 | 6.02 |
| 85.50576422461883 | 2.86 | 5.12 | -0.46 | 6.03 |
| 85.66381554481221 | 2.82 | 5.16 | -0.57 | 6.05 |
| 85.83116400148755 | 2.75 | 5.19 | -0.7 | 6.06 |
| 85.99851245816289 | 2.74 | 5.3 | -0.82 | 6.16 |
| 86.16586091483823 | 2.73 | 5.44 | -0.93 | 6.29 |
| 86.33320937151358 | 2.64 | 5.6 | -1.05 | 6.41 |
| 86.50055782818893 | 2.52 | 5.71 | -1.16 | 6.49 |
| 86.66790628486427 | 2.39 | 5.89 | -1.24 | 6.62 |
| 86.83525474153961 | 2.29 | 6.15 | -1.35 | 6.85 |
| 87.00260319821496 | 2.22 | 6.35 | -1.53 | 7.05 |
| 87.16995165489031 | 2.22 | 6.54 | -1.74 | 7.28 |
| 87.33730011156564 | 2.26 | 6.72 | -1.96 | 7.52 |
| 87.504648568241 | 2.39 | 6.88 | -2.16 | 7.77 |
| 87.67199702491634 | 2.62 | 7.01 | -2.36 | 8.01 |
| 87.83004834510972 | 2.87 | 7.09 | -2.53 | 8.22 |
| 87.99739680178506 | 3.23 | 7.18 | -2.64 | 8.46 |
| 88.1647452584604 | 3.5 | 7.25 | -2.71 | 8.64 |
| 88.33209371513574 | 3.7 | 7.34 | -2.79 | 8.84 |
| 88.49944217181108 | 3.85 | 7.52 | -2.88 | 9.08 |
| 88.66679062848644 | 3.8 | 7.6 | -3.01 | 9.17 |
| 88.83413908516178 | 3.71 | 7.57 | -3.13 | 9.15 |
| 89.00148754183712 | 3.82 | 7.54 | -3.19 | 9.18 |
| 89.16883599851246 | 3.86 | 7.64 | -3.24 | 9.29 |
| 89.33618445518782 | 3.9 | 7.74 | -3.31 | 9.4 |
| 89.50353291186315 | 3.96 | 7.87 | -3.39 | 9.55 |
| 89.6708813685385 | 3.98 | 8 | -3.48 | 9.7 |
| 89.83822982521386 | 3.96 | 8.09 | -3.58 | 9.8 |
| 90.00557828188919 | 3.87 | 8.17 | -3.7 | 9.87 |
| 90.16362960208257 | 3.78 | 8.31 | -3.81 | 9.98 |
| 90.3309780587579 | 3.67 | 8.48 | -3.93 | 10.12 |
| 90.49832651543326 | 3.72 | 8.66 | -4.04 | 10.33 |
| 90.66567497210859 | 3.8 | 8.9 | -4.13 | 10.6 |
| 90.83302342878395 | 3.83 | 9.16 | -4.23 | 10.86 |
| 91.00037188545929 | 3.91 | 9.44 | -4.3 | 11.16 |
| 91.16772034213463 | 3.94 | 9.64 | -4.37 | 11.37 |
| 91.33506879880998 | 3.93 | 9.81 | -4.44 | 11.54 |
| 91.50241725548533 | 3.9 | 9.97 | -4.51 | 11.69 |
| 91.66976571216065 | 3.87 | 10.12 | -4.58 | 11.83 |
| 91.83711416883601 | 3.85 | 10.22 | -4.64 | 11.92 |
| 92.00446262551137 | 3.77 | 10.25 | -4.67 | 11.94 |
| 92.1718110821867 | 3.7 | 10.28 | -4.7 | 11.96 |
| 92.33915953886203 | 3.61 | 10.29 | -4.72 | 11.95 |
| 92.49721085905541 | 3.66 | 10.29 | -4.75 | 11.97 |
| 92.66455931573077 | 3.72 | 10.29 | -4.77 | 12 |
| 92.83190777240611 | 3.77 | 10.3 | -4.79 | 12.03 |
| 92.99925622908145 | 3.8 | 10.3 | -4.8 | 12.05 |
| 93.1666046857568 | 3.8 | 10.28 | -4.81 | 12.04 |
| 93.33395314243214 | 3.69 | 10.26 | -4.78 | 11.98 |
| 93.50130159910749 | 3.45 | 10.09 | -4.77 | 11.78 |
| 93.66865005578283 | 3.3 | 9.98 | -4.77 | 11.64 |
| 93.83599851245818 | 3.23 | 9.87 | -4.78 | 11.54 |
| 94.00334696913353 | 3.23 | 9.77 | -4.79 | 11.45 |
| 94.17069542580886 | 3.23 | 9.67 | -4.79 | 11.38 |
| 94.3380438824842 | 3.19 | 9.61 | -4.81 | 11.31 |
| 94.50539233915954 | 3.13 | 9.57 | -4.81 | 11.26 |
| 94.66344365935292 | 3.06 | 9.55 | -4.81 | 11.22 |
| 94.83079211602828 | 2.98 | 9.55 | -4.82 | 11.19 |
| 94.99814057270362 | 2.94 | 9.55 | -4.84 | 11.19 |
| 95.16548902937897 | 2.95 | 9.55 | -4.85 | 11.2 |
| 95.33283748605432 | 2.92 | 9.48 | -4.86 | 11.14 |
| 95.50018594272963 | 2.92 | 9.43 | -4.86 | 11.09 |
| 95.66753439940499 | 2.91 | 9.37 | -4.85 | 11.03 |
| 95.83488285608034 | 2.83 | 9.24 | -4.87 | 10.91 |
| 96.00223131275567 | 2.81 | 9.14 | -4.85 | 10.81 |
| 96.16957976943102 | 2.84 | 9.07 | -4.83 | 10.75 |
| 96.33692822610638 | 2.88 | 9.03 | -4.81 | 10.73 |
| 96.50427668278171 | 2.81 | 8.87 | -4.78 | 10.56 |
| 96.67162513945706 | 2.74 | 8.74 | -4.76 | 10.44 |
| 96.8389735961324 | 2.67 | 8.63 | -4.74 | 10.32 |
| 96.99702491632577 | 2.58 | 8.53 | -4.74 | 10.23 |
| 97.16437337300111 | 2.51 | 8.44 | -4.75 | 10.14 |
| 97.33172182967647 | 2.43 | 8.35 | -4.72 | 10.04 |
| 97.49907028635181 | 2.34 | 8.3 | -4.67 | 9.95 |
| 97.66641874302715 | 2.26 | 8.3 | -4.62 | 9.91 |
| 97.8337671997025 | 2.17 | 8.32 | -4.57 | 9.89 |
| 98.00111565637785 | 2.09 | 8.3 | -4.55 | 9.84 |
| 98.16846411305319 | 2.04 | 8.23 | -4.54 | 9.76 |
| 98.33581256972855 | 1.97 | 8.13 | -4.52 | 9.66 |
| 98.50316102640389 | 1.94 | 8.05 | -4.5 | 9.57 |
| 98.67050948307921 | 1.9 | 7.98 | -4.49 | 9.5 |
| 98.83785793975456 | 1.86 | 7.86 | -4.48 | 9.4 |
| 99.0052063964299 | 1.84 | 7.8 | -4.48 | 9.35 |
| 99.17255485310525 | 1.83 | 7.74 | -4.49 | 9.3 |
| 99.33060617329863 | 1.86 | 7.68 | -4.5 | 9.27 |
| 99.49795462997399 | 1.89 | 7.66 | -4.52 | 9.27 |
| 99.66530308664933 | 1.92 | 7.64 | -4.53 | 9.27 |
| 99.83265154332467 | 1.91 | 7.58 | -4.53 | 9.23 |
| 100.0 | 1.92 | 7.56 | -4.54 | 9.23 |